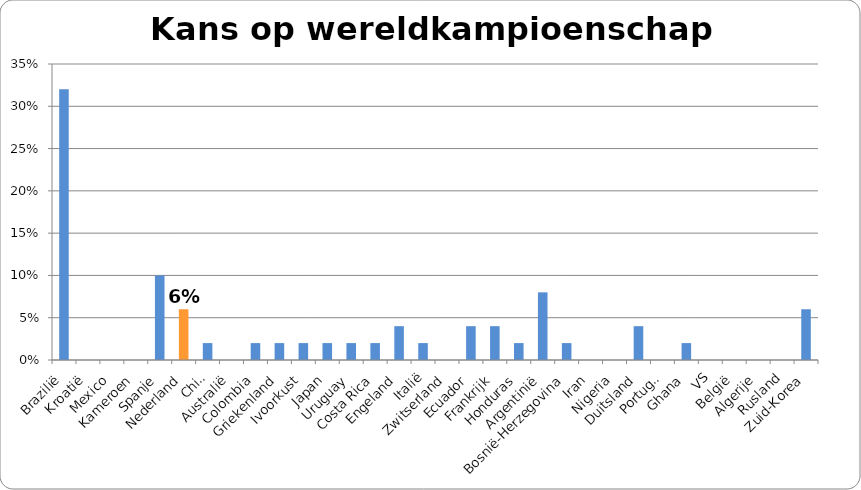
| Category | Perc |
|---|---|
| Brazilië | 0.32 |
| Kroatië | 0 |
| Mexico | 0 |
| Kameroen | 0 |
| Spanje | 0.1 |
| Nederland | 0.06 |
| Chili | 0.02 |
| Australië | 0 |
| Colombia | 0.02 |
| Griekenland | 0.02 |
| Ivoorkust | 0.02 |
| Japan | 0.02 |
| Uruguay | 0.02 |
| Costa Rica | 0.02 |
| Engeland | 0.04 |
| Italië | 0.02 |
| Zwitserland | 0 |
| Ecuador | 0.04 |
| Frankrijk | 0.04 |
| Honduras | 0.02 |
| Argentinië | 0.08 |
| Bosnië-Herzegovina | 0.02 |
| Iran | 0 |
| Nigeria | 0 |
| Duitsland | 0.04 |
| Portugal | 0 |
| Ghana | 0.02 |
| VS | 0 |
| België | 0 |
| Algerije | 0 |
| Rusland | 0 |
| Zuid-Korea | 0.06 |